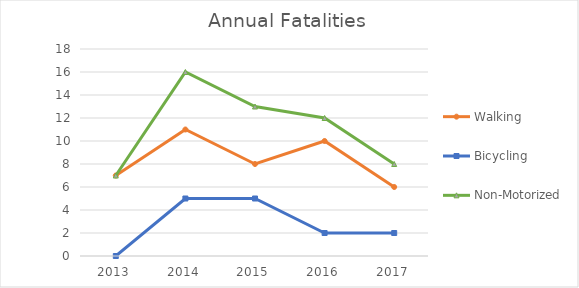
| Category | Walking | Bicycling | Non-Motorized |
|---|---|---|---|
| 2013 | 7 | 0 | 7 |
| 2014 | 11 | 5 | 16 |
| 2015 | 8 | 5 | 13 |
| 2016 | 10 | 2 | 12 |
| 2017 | 6 | 2 | 8 |